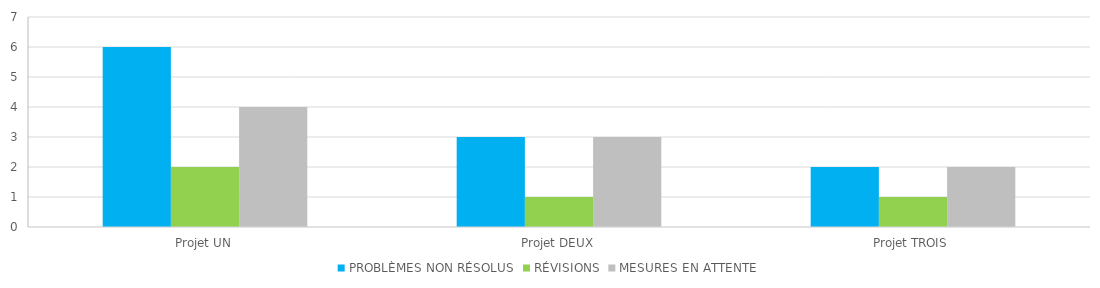
| Category | PROBLÈMES NON RÉSOLUS | RÉVISIONS | MESURES EN ATTENTE |
|---|---|---|---|
| Projet UN | 6 | 2 | 4 |
| Projet DEUX | 3 | 1 | 3 |
| Projet TROIS | 2 | 1 | 2 |